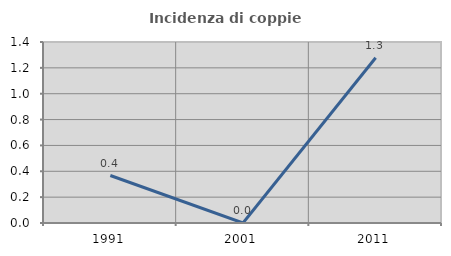
| Category | Incidenza di coppie miste |
|---|---|
| 1991.0 | 0.367 |
| 2001.0 | 0 |
| 2011.0 | 1.278 |